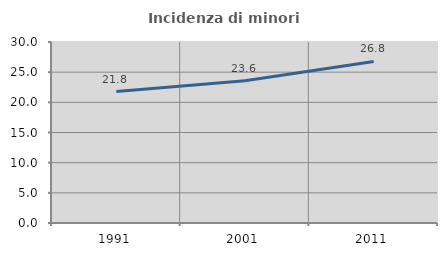
| Category | Incidenza di minori stranieri |
|---|---|
| 1991.0 | 21.782 |
| 2001.0 | 23.563 |
| 2011.0 | 26.782 |